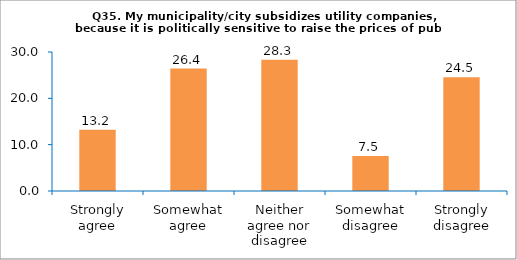
| Category | Series 0 |
|---|---|
| Strongly agree | 13.208 |
| Somewhat agree | 26.415 |
| Neither agree nor disagree | 28.302 |
| Somewhat disagree | 7.547 |
| Strongly disagree | 24.528 |